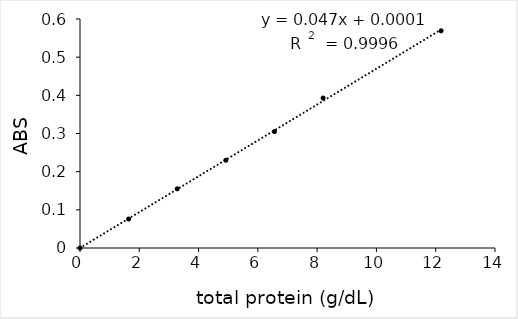
| Category | -blank |
|---|---|
| 0.0 | 0 |
| 1.64 | 0.076 |
| 3.28 | 0.155 |
| 4.92 | 0.23 |
| 6.56 | 0.305 |
| 8.2 | 0.393 |
| 12.180582524271843 | 0.569 |